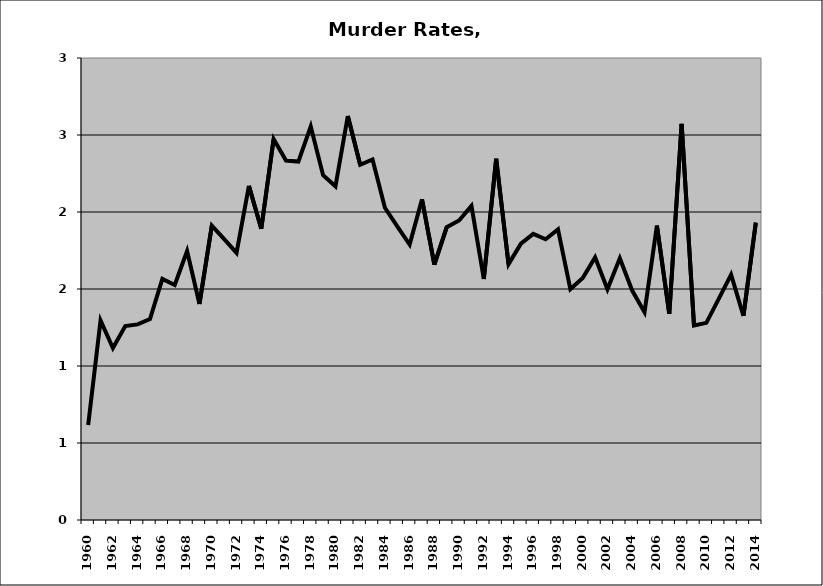
| Category | Murder |
|---|---|
| 1960.0 | 0.616 |
| 1961.0 | 1.295 |
| 1962.0 | 1.116 |
| 1963.0 | 1.259 |
| 1964.0 | 1.27 |
| 1965.0 | 1.304 |
| 1966.0 | 1.565 |
| 1967.0 | 1.526 |
| 1968.0 | 1.747 |
| 1969.0 | 1.402 |
| 1970.0 | 1.911 |
| 1971.0 | 1.823 |
| 1972.0 | 1.734 |
| 1973.0 | 2.169 |
| 1974.0 | 1.891 |
| 1975.0 | 2.474 |
| 1976.0 | 2.334 |
| 1977.0 | 2.327 |
| 1978.0 | 2.555 |
| 1979.0 | 2.239 |
| 1980.0 | 2.167 |
| 1981.0 | 2.623 |
| 1982.0 | 2.306 |
| 1983.0 | 2.341 |
| 1984.0 | 2.027 |
| 1985.0 | 1.907 |
| 1986.0 | 1.789 |
| 1987.0 | 2.082 |
| 1988.0 | 1.658 |
| 1989.0 | 1.901 |
| 1990.0 | 1.945 |
| 1991.0 | 2.039 |
| 1992.0 | 1.565 |
| 1993.0 | 2.345 |
| 1994.0 | 1.661 |
| 1995.0 | 1.795 |
| 1996.0 | 1.858 |
| 1997.0 | 1.823 |
| 1998.0 | 1.887 |
| 1999.0 | 1.499 |
| 2000.0 | 1.572 |
| 2001.0 | 1.705 |
| 2002.0 | 1.499 |
| 2003.0 | 1.7 |
| 2004.0 | 1.49 |
| 2005.0 | 1.349 |
| 2006.0 | 1.911 |
| 2007.0 | 1.339 |
| 2008.0 | 2.572 |
| 2009.0 | 1.263 |
| 2010.0 | 1.28 |
| 2011.0 | 1.436 |
| 2012.0 | 1.593 |
| 2013.0 | 1.326 |
| 2014.0 | 1.931 |